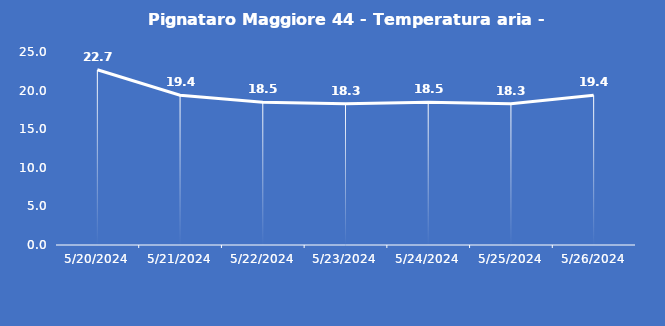
| Category | Pignataro Maggiore 44 - Temperatura aria - Grezzo (°C) |
|---|---|
| 5/20/24 | 22.7 |
| 5/21/24 | 19.4 |
| 5/22/24 | 18.5 |
| 5/23/24 | 18.3 |
| 5/24/24 | 18.5 |
| 5/25/24 | 18.3 |
| 5/26/24 | 19.4 |